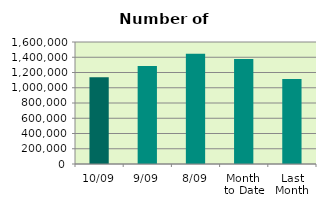
| Category | Series 0 |
|---|---|
| 10/09 | 1136816 |
| 9/09 | 1286448 |
| 8/09 | 1445528 |
| Month 
to Date | 1375615.5 |
| Last
Month | 1113186.286 |